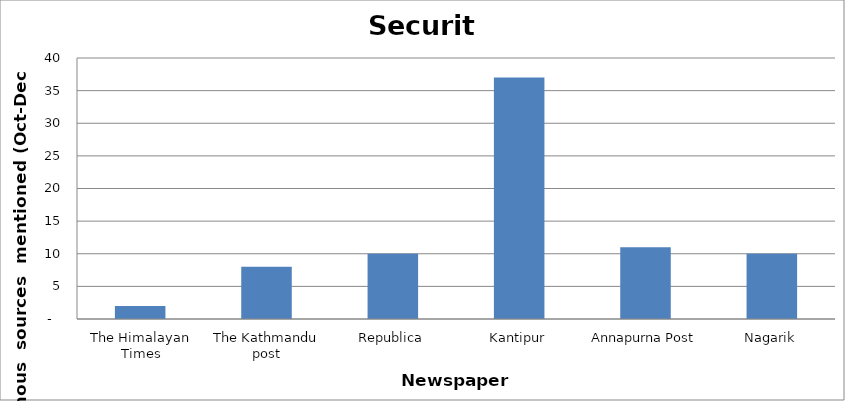
| Category | Security |
|---|---|
| The Himalayan Times | 2 |
| The Kathmandu post | 8 |
| Republica | 10 |
| Kantipur | 37 |
| Annapurna Post | 11 |
| Nagarik | 10 |